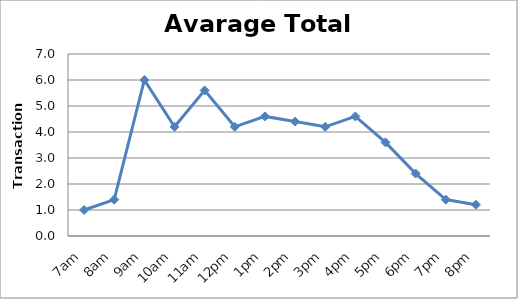
| Category | Series 0 |
|---|---|
| 7am | 1 |
| 8am | 1.4 |
| 9am | 6 |
| 10am | 4.2 |
| 11am | 5.6 |
| 12pm | 4.2 |
| 1pm | 4.6 |
| 2pm | 4.4 |
| 3pm | 4.2 |
| 4pm | 4.6 |
| 5pm | 3.6 |
| 6pm | 2.4 |
| 7pm | 1.4 |
| 8pm | 1.2 |